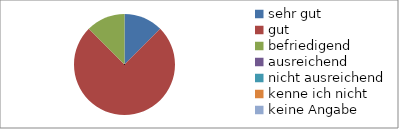
| Category | Series 0 |
|---|---|
| sehr gut | 3 |
| gut | 18 |
| befriedigend | 3 |
| ausreichend | 0 |
| nicht ausreichend | 0 |
| kenne ich nicht | 0 |
| keine Angabe | 0 |